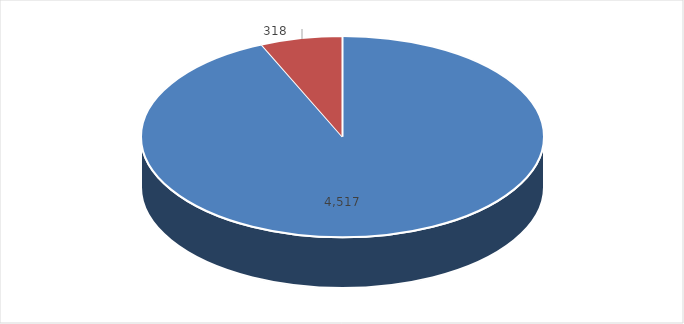
| Category | Series 0 |
|---|---|
| Ordinario  | 4517 |
| NNA | 318 |